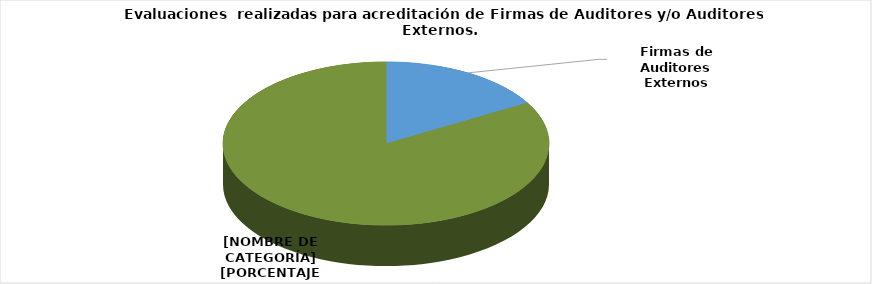
| Category | Series 0 |
|---|---|
| Firmas de Auditores Externos | 13 |
| Auditores Externos | 65 |